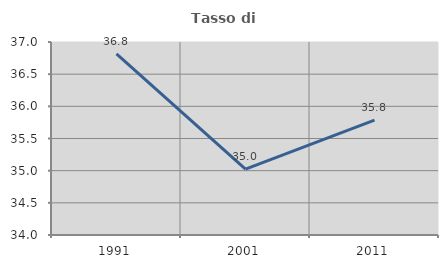
| Category | Tasso di occupazione   |
|---|---|
| 1991.0 | 36.817 |
| 2001.0 | 35.023 |
| 2011.0 | 35.786 |